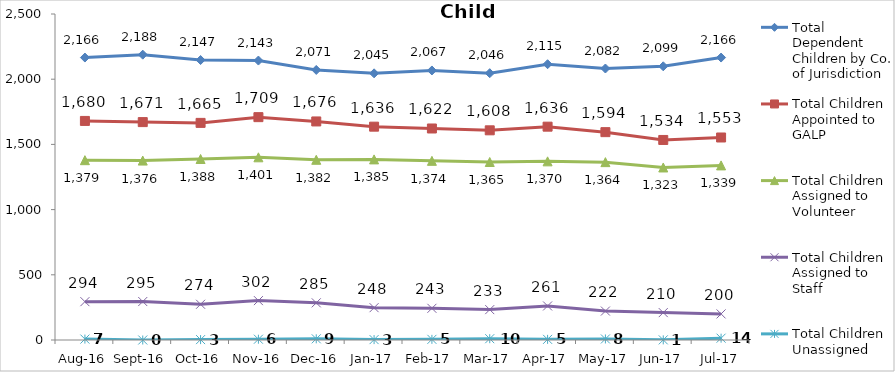
| Category | Total Dependent Children by Co. of Jurisdiction | Total Children Appointed to GALP | Total Children Assigned to Volunteer | Total Children Assigned to Staff | Total Children Unassigned |
|---|---|---|---|---|---|
| Aug-16 | 2166 | 1680 | 1379 | 294 | 7 |
| Sep-16 | 2188 | 1671 | 1376 | 295 | 0 |
| Oct-16 | 2147 | 1665 | 1388 | 274 | 3 |
| Nov-16 | 2143 | 1709 | 1401 | 302 | 6 |
| Dec-16 | 2071 | 1676 | 1382 | 285 | 9 |
| Jan-17 | 2045 | 1636 | 1385 | 248 | 3 |
| Feb-17 | 2067 | 1622 | 1374 | 243 | 5 |
| Mar-17 | 2046 | 1608 | 1365 | 233 | 10 |
| Apr-17 | 2115 | 1636 | 1370 | 261 | 5 |
| May-17 | 2082 | 1594 | 1364 | 222 | 8 |
| Jun-17 | 2099 | 1534 | 1323 | 210 | 1 |
| Jul-17 | 2166 | 1553 | 1339 | 200 | 14 |